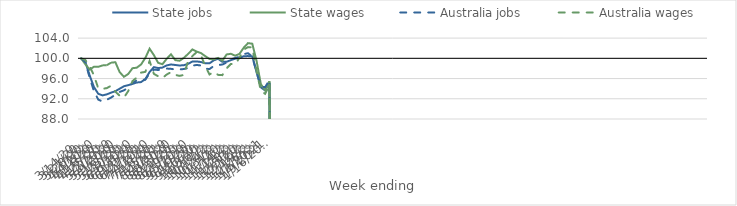
| Category | State jobs | State wages | Australia jobs | Australia wages |
|---|---|---|---|---|
| 14/03/2020 | 100 | 100 | 100 | 100 |
| 21/03/2020 | 99.258 | 98.817 | 99.215 | 99.668 |
| 28/03/2020 | 96.594 | 97.774 | 96.153 | 98.379 |
| 04/04/2020 | 94.306 | 98.345 | 93.502 | 96.626 |
| 11/04/2020 | 92.987 | 98.322 | 91.838 | 94.061 |
| 18/04/2020 | 92.673 | 98.602 | 91.448 | 93.977 |
| 25/04/2020 | 92.871 | 98.643 | 91.813 | 94.111 |
| 02/05/2020 | 93.22 | 99.142 | 92.231 | 94.578 |
| 09/05/2020 | 93.499 | 99.231 | 92.806 | 93.416 |
| 16/05/2020 | 93.989 | 97.273 | 93.353 | 92.605 |
| 23/05/2020 | 94.474 | 96.35 | 93.674 | 92.236 |
| 30/05/2020 | 94.693 | 96.897 | 94.181 | 93.508 |
| 06/06/2020 | 94.943 | 98.047 | 95.128 | 95.497 |
| 13/06/2020 | 95.222 | 98.148 | 95.639 | 96.189 |
| 20/06/2020 | 95.302 | 98.783 | 95.802 | 97.174 |
| 27/06/2020 | 95.888 | 100.076 | 95.768 | 97.323 |
| 04/07/2020 | 97.295 | 101.912 | 97.053 | 99.476 |
| 11/07/2020 | 98.261 | 100.635 | 97.772 | 96.928 |
| 18/07/2020 | 98.081 | 99.114 | 97.691 | 96.451 |
| 25/07/2020 | 98.168 | 98.83 | 97.829 | 96.097 |
| 01/08/2020 | 98.598 | 99.918 | 97.979 | 96.806 |
| 08/08/2020 | 98.784 | 100.798 | 97.922 | 97.248 |
| 15/08/2020 | 98.684 | 99.646 | 97.789 | 96.723 |
| 22/08/2020 | 98.584 | 99.524 | 97.812 | 96.531 |
| 29/08/2020 | 98.64 | 100.092 | 97.884 | 96.715 |
| 05/09/2020 | 98.902 | 100.875 | 98.101 | 99.468 |
| 12/09/2020 | 99.374 | 101.755 | 98.536 | 100.455 |
| 19/09/2020 | 99.387 | 101.336 | 98.701 | 101.226 |
| 26/09/2020 | 99.272 | 101.042 | 98.574 | 100.61 |
| 03/10/2020 | 99.014 | 100.439 | 97.954 | 98.463 |
| 10/10/2020 | 99.01 | 99.875 | 97.882 | 96.815 |
| 17/10/2020 | 99.606 | 99.806 | 98.486 | 97.316 |
| 24/10/2020 | 99.908 | 100.082 | 98.675 | 96.732 |
| 31/10/2020 | 99.31 | 99.526 | 98.779 | 96.679 |
| 07/11/2020 | 99.323 | 100.768 | 99.161 | 98.026 |
| 14/11/2020 | 99.646 | 100.899 | 99.803 | 98.893 |
| 21/11/2020 | 99.937 | 100.519 | 100.059 | 98.847 |
| 28/11/2020 | 100.059 | 100.877 | 100.31 | 100.101 |
| 05/12/2020 | 100.422 | 102.107 | 100.817 | 101.732 |
| 12/12/2020 | 100.441 | 103.008 | 101.015 | 102.219 |
| 19/12/2020 | 100.384 | 102.894 | 100.355 | 102.16 |
| 26/12/2020 | 97.234 | 99.474 | 97.322 | 97.485 |
| 02/01/2021 | 94.262 | 94.912 | 94.445 | 93.574 |
| 09/01/2021 | 93.655 | 93.661 | 94.284 | 92.978 |
| 16/01/2021 | 95.16 | 95.458 | 95.7 | 94.76 |